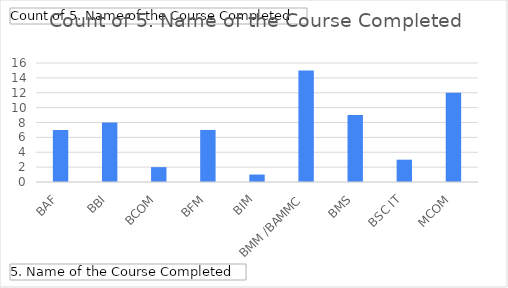
| Category | Total |
|---|---|
| BAF | 7 |
| BBI | 8 |
| BCOM | 2 |
| BFM | 7 |
| BIM | 1 |
| BMM /BAMMC | 15 |
| BMS | 9 |
| BSC IT | 3 |
| MCOM | 12 |